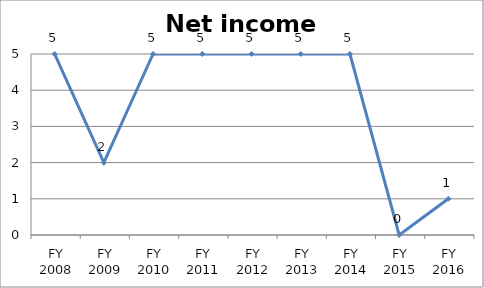
| Category | Net income score |
|---|---|
| FY 2016 | 1 |
| FY 2015 | 0 |
| FY 2014 | 5 |
| FY 2013 | 5 |
| FY 2012 | 5 |
| FY 2011 | 5 |
| FY 2010 | 5 |
| FY 2009 | 2 |
| FY 2008 | 5 |